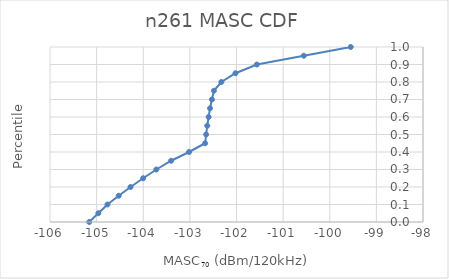
| Category | n261 |
|---|---|
| -105.159215780241 | 0 |
| -104.96336867913256 | 0.05 |
| -104.7675215780241 | 0.1 |
| -104.5266 | 0.15 |
| -104.2728 | 0.2 |
| -104.0025 | 0.25 |
| -103.719 | 0.3 |
| -103.40196 | 0.35 |
| -103.01784 | 0.4 |
| -102.67382500000001 | 0.45 |
| -102.65065 | 0.5 |
| -102.62747499999999 | 0.55 |
| -102.59799440717065 | 0.6 |
| -102.56772561523763 | 0.65 |
| -102.52834521254864 | 0.7 |
| -102.48440900448165 | 0.75 |
| -102.32531110898779 | 0.8 |
| -102.02226110421036 | 0.85 |
| -101.5628999904451 | 0.9 |
| -100.55644999522255 | 0.95 |
| -99.55 | 1 |